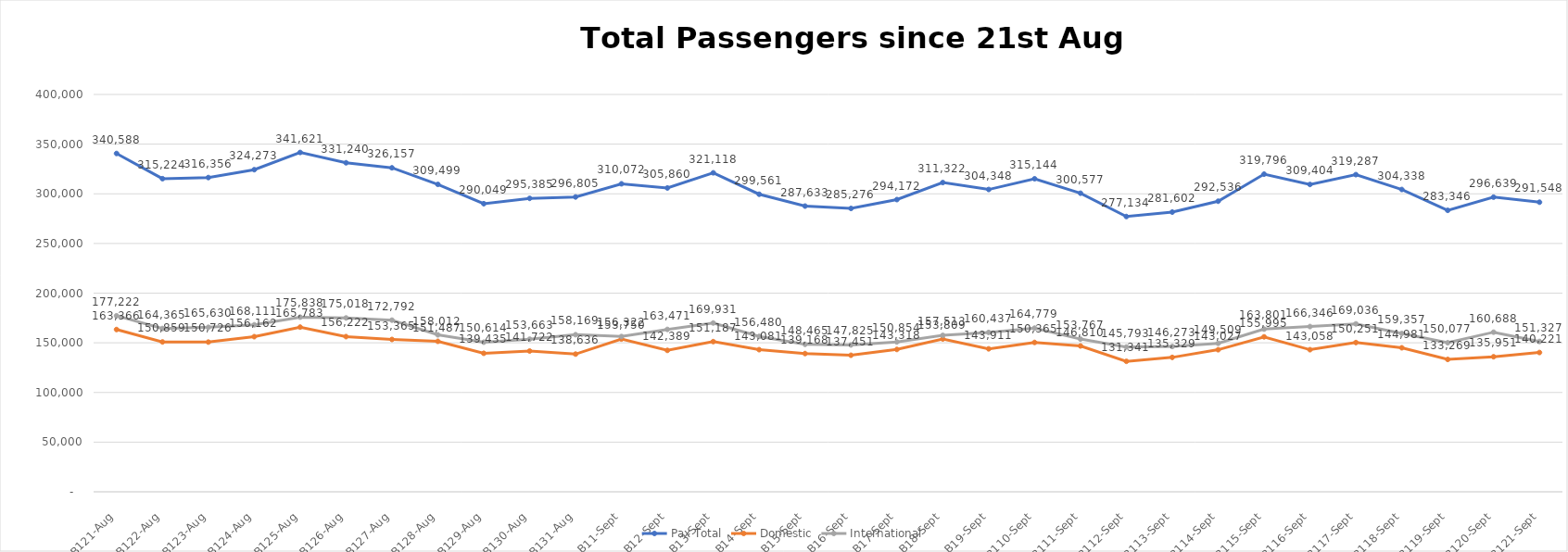
| Category | Pax Total | Domestic | International |
|---|---|---|---|
| 2023-08-21 | 340588 | 163366 | 177222 |
| 2023-08-22 | 315224 | 150859 | 164365 |
| 2023-08-23 | 316356 | 150726 | 165630 |
| 2023-08-24 | 324273 | 156162 | 168111 |
| 2023-08-25 | 341621 | 165783 | 175838 |
| 2023-08-26 | 331240 | 156222 | 175018 |
| 2023-08-27 | 326157 | 153365 | 172792 |
| 2023-08-28 | 309499 | 151487 | 158012 |
| 2023-08-29 | 290049 | 139435 | 150614 |
| 2023-08-30 | 295385 | 141722 | 153663 |
| 2023-08-31 | 296805 | 138636 | 158169 |
| 2023-09-01 | 310072 | 153750 | 156322 |
| 2023-09-02 | 305860 | 142389 | 163471 |
| 2023-09-03 | 321118 | 151187 | 169931 |
| 2023-09-04 | 299561 | 143081 | 156480 |
| 2023-09-05 | 287633 | 139168 | 148465 |
| 2023-09-06 | 285276 | 137451 | 147825 |
| 2023-09-07 | 294172 | 143318 | 150854 |
| 2023-09-08 | 311322 | 153809 | 157513 |
| 2023-09-09 | 304348 | 143911 | 160437 |
| 2023-09-10 | 315144 | 150365 | 164779 |
| 2023-09-11 | 300577 | 146810 | 153767 |
| 2023-09-12 | 277134 | 131341 | 145793 |
| 2023-09-13 | 281602 | 135329 | 146273 |
| 2023-09-14 | 292536 | 143027 | 149509 |
| 2023-09-15 | 319796 | 155995 | 163801 |
| 2023-09-16 | 309404 | 143058 | 166346 |
| 2023-09-17 | 319287 | 150251 | 169036 |
| 2023-09-18 | 304338 | 144981 | 159357 |
| 2023-09-19 | 283346 | 133269 | 150077 |
| 2023-09-20 | 296639 | 135951 | 160688 |
| 2023-09-21 | 291548 | 140221 | 151327 |